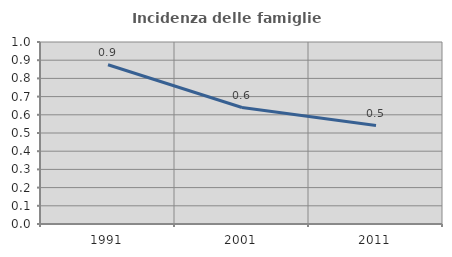
| Category | Incidenza delle famiglie numerose |
|---|---|
| 1991.0 | 0.875 |
| 2001.0 | 0.64 |
| 2011.0 | 0.541 |